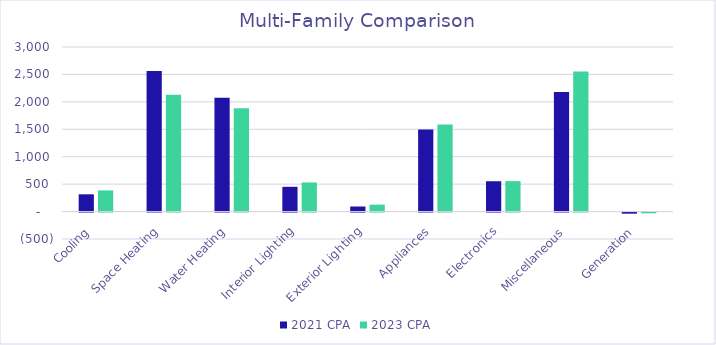
| Category | 2021 CPA | 2023 CPA |
|---|---|---|
|  Cooling  | 314.728 | 385.957 |
|  Space Heating  | 2560.864 | 2130.89 |
|  Water Heating  | 2076.17 | 1884.767 |
|  Interior Lighting  | 451.415 | 530.555 |
|  Exterior Lighting  | 92.528 | 126.208 |
|  Appliances  | 1497.76 | 1586.948 |
|  Electronics  | 553.018 | 554.713 |
|  Miscellaneous  | 2179.893 | 2551.232 |
|  Generation  | -20.273 | -14.265 |